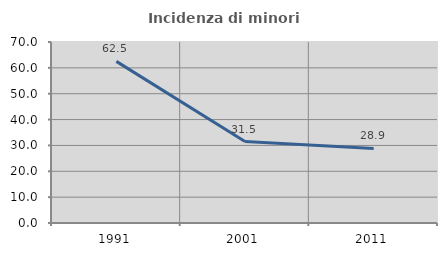
| Category | Incidenza di minori stranieri |
|---|---|
| 1991.0 | 62.5 |
| 2001.0 | 31.481 |
| 2011.0 | 28.854 |